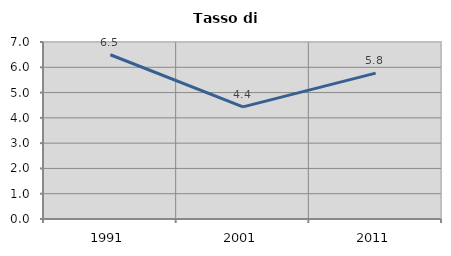
| Category | Tasso di disoccupazione   |
|---|---|
| 1991.0 | 6.495 |
| 2001.0 | 4.436 |
| 2011.0 | 5.768 |